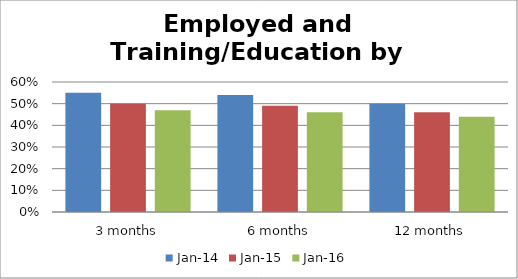
| Category | Jan-14 | Jan-15 | Jan-16 |
|---|---|---|---|
| 3 months | 0.55 | 0.5 | 0.47 |
| 6 months | 0.54 | 0.49 | 0.46 |
| 12 months | 0.5 | 0.46 | 0.44 |